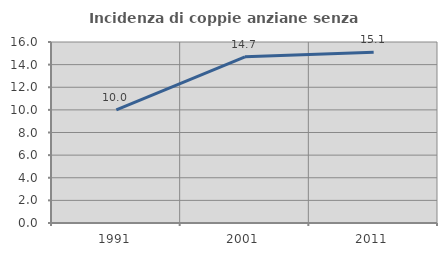
| Category | Incidenza di coppie anziane senza figli  |
|---|---|
| 1991.0 | 10 |
| 2001.0 | 14.694 |
| 2011.0 | 15.094 |